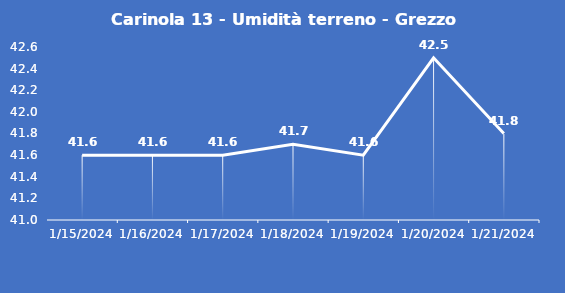
| Category | Carinola 13 - Umidità terreno - Grezzo (%VWC) |
|---|---|
| 1/15/24 | 41.6 |
| 1/16/24 | 41.6 |
| 1/17/24 | 41.6 |
| 1/18/24 | 41.7 |
| 1/19/24 | 41.6 |
| 1/20/24 | 42.5 |
| 1/21/24 | 41.8 |